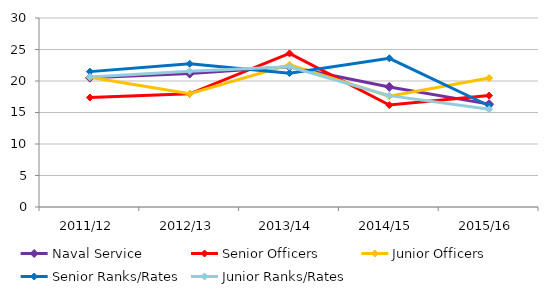
| Category | Naval Service | Senior Officers | Junior Officers | Senior Ranks/Rates | Junior Ranks/Rates |
|---|---|---|---|---|---|
| 2011/12 | 20.531 | 17.376 | 20.602 | 21.488 | 20.654 |
| 2012/13 | 21.178 | 17.964 | 17.976 | 22.741 | 21.555 |
| 2013/14 | 22.256 | 24.377 | 22.575 | 21.244 | 22.271 |
| 2014/15 | 19.061 | 16.177 | 17.58 | 23.606 | 17.678 |
| 2015/16 | 16.326 | 17.683 | 20.47 | 16.069 | 15.523 |